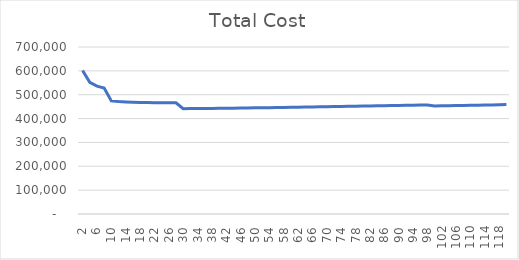
| Category | Total Cost |
|---|---|
| 2.0 | 601600 |
| 4.0 | 552200 |
| 6.0 | 536133.333 |
| 8.0 | 528400 |
| 10.0 | 473900 |
| 12.0 | 471166.667 |
| 14.0 | 469385.714 |
| 16.0 | 468200 |
| 18.0 | 467411.111 |
| 20.0 | 466900 |
| 22.0 | 466590.909 |
| 24.0 | 466433.333 |
| 26.0 | 466392.308 |
| 28.0 | 466442.857 |
| 30.0 | 441516.667 |
| 32.0 | 441700 |
| 34.0 | 441932.353 |
| 36.0 | 442205.556 |
| 38.0 | 442513.158 |
| 40.0 | 442850 |
| 42.0 | 443211.905 |
| 44.0 | 443595.455 |
| 46.0 | 443997.826 |
| 48.0 | 444416.667 |
| 50.0 | 444850 |
| 52.0 | 445296.154 |
| 54.0 | 445753.704 |
| 56.0 | 446221.429 |
| 58.0 | 446698.276 |
| 60.0 | 447183.333 |
| 62.0 | 447675.806 |
| 64.0 | 448175 |
| 66.0 | 448680.303 |
| 68.0 | 449191.176 |
| 70.0 | 449707.143 |
| 72.0 | 450227.778 |
| 74.0 | 450752.703 |
| 76.0 | 451281.579 |
| 78.0 | 451814.103 |
| 80.0 | 452350 |
| 82.0 | 452889.024 |
| 84.0 | 453430.952 |
| 86.0 | 453975.581 |
| 88.0 | 454522.727 |
| 90.0 | 455072.222 |
| 92.0 | 455623.913 |
| 94.0 | 456177.66 |
| 96.0 | 456733.333 |
| 98.0 | 457290.816 |
| 100.0 | 452840 |
| 102.0 | 453400.784 |
| 104.0 | 453963.077 |
| 106.0 | 454526.792 |
| 108.0 | 455091.852 |
| 110.0 | 455658.182 |
| 112.0 | 456225.714 |
| 114.0 | 456794.386 |
| 116.0 | 457364.138 |
| 118.0 | 457934.915 |
| 120.0 | 458506.667 |